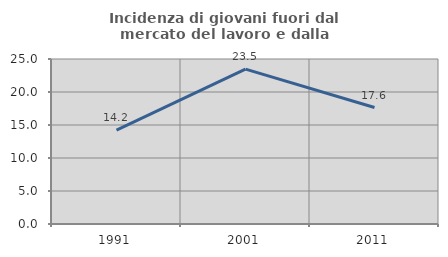
| Category | Incidenza di giovani fuori dal mercato del lavoro e dalla formazione  |
|---|---|
| 1991.0 | 14.216 |
| 2001.0 | 23.468 |
| 2011.0 | 17.647 |